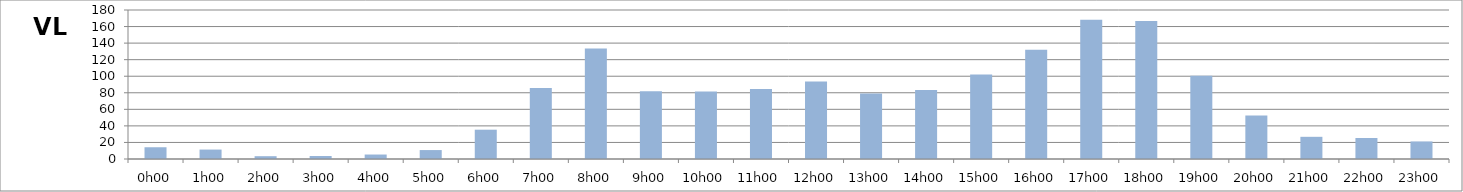
| Category | VL |
|---|---|
| 0.0 | 14.2 |
| 0.041666666666666664 | 11.4 |
| 0.08333333333333333 | 3.4 |
| 0.125 | 3.6 |
| 0.16666666666666666 | 5.4 |
| 0.20833333333333334 | 10.8 |
| 0.25 | 35.4 |
| 0.2916666666666667 | 85.8 |
| 0.3333333333333333 | 133.4 |
| 0.375 | 81.8 |
| 0.4166666666666667 | 81.6 |
| 0.4583333333333333 | 84.6 |
| 0.5 | 93.6 |
| 0.5416666666666666 | 79.2 |
| 0.5833333333333334 | 83.4 |
| 0.625 | 102 |
| 0.6666666666666666 | 132 |
| 0.7083333333333334 | 168.2 |
| 0.75 | 166.8 |
| 0.7916666666666666 | 100.6 |
| 0.8333333333333334 | 52.6 |
| 0.875 | 26.8 |
| 0.9166666666666666 | 25.4 |
| 0.9583333333333334 | 21.2 |